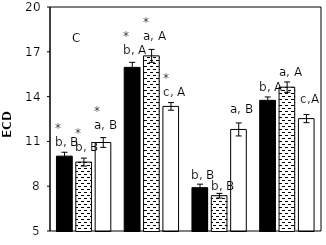
| Category |    A. brasilense |    A. chroococcum |    CK |
|---|---|---|---|
| aCO2-Bt | 10.013 | 9.615 | 10.926 |
| aCO2-XIANYU | 15.957 | 16.728 | 13.344 |
| eCO2-Bt | 7.902 | 7.364 | 11.8 |
| eCO2-XIANYU | 13.748 | 14.632 | 12.526 |